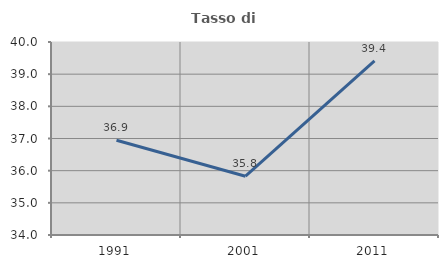
| Category | Tasso di occupazione   |
|---|---|
| 1991.0 | 36.946 |
| 2001.0 | 35.828 |
| 2011.0 | 39.41 |